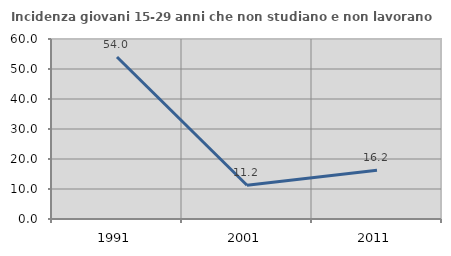
| Category | Incidenza giovani 15-29 anni che non studiano e non lavorano  |
|---|---|
| 1991.0 | 54.005 |
| 2001.0 | 11.241 |
| 2011.0 | 16.232 |